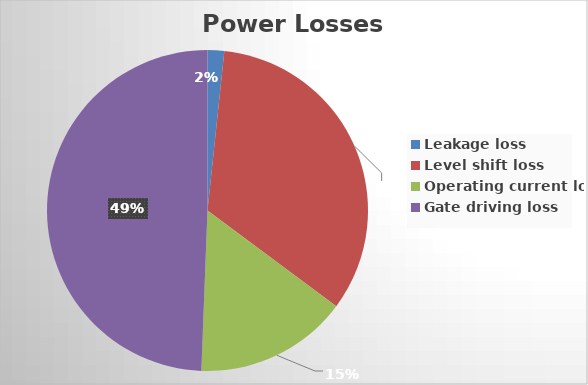
| Category | Series 0 |
|---|---|
| Leakage loss | 8.14 |
| Level shift loss | 162.8 |
| Operating current loss | 75 |
| Gate driving loss | 240 |